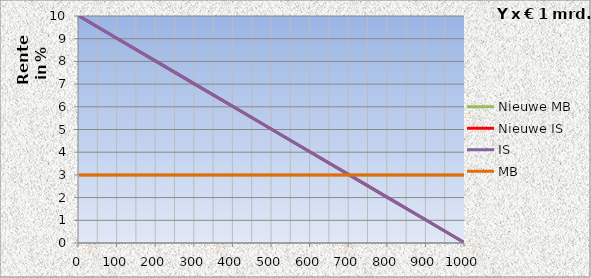
| Category | Nieuwe MB | Nieuwe IS | IS | MB |
|---|---|---|---|---|
| 0.0 | 3 | 10 | 10 | 3 |
| 100.0 | 3 | 9 | 9 | 3 |
| 200.0 | 3 | 8 | 8 | 3 |
| 300.0 | 3 | 7 | 7 | 3 |
| 400.0 | 3 | 6 | 6 | 3 |
| 500.0 | 3 | 5 | 5 | 3 |
| 600.0 | 3 | 4 | 4 | 3 |
| 700.0 | 3 | 3 | 3 | 3 |
| 800.0 | 3 | 2 | 2 | 3 |
| 900.0 | 3 | 1 | 1 | 3 |
| 1000.0 | 3 | 0 | 0 | 3 |